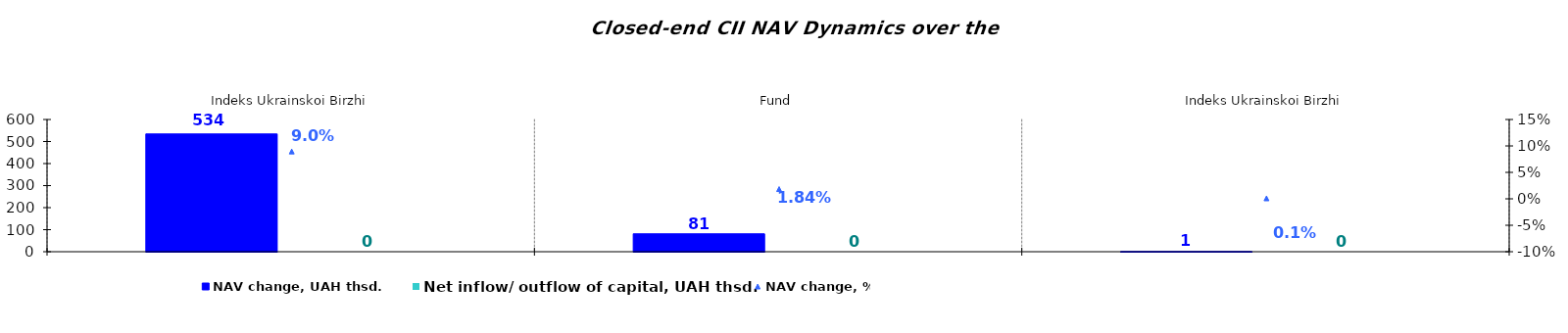
| Category | NAV change, UAH thsd. | Net inflow/ outflow of capital, UAH thsd. |
|---|---|---|
| Indeks Ukrainskoi Birzhi | 534.441 | 0 |
| Fund | 81.205 | 0 |
| Indeks Ukrainskoi Birzhi | 0.946 | 0 |